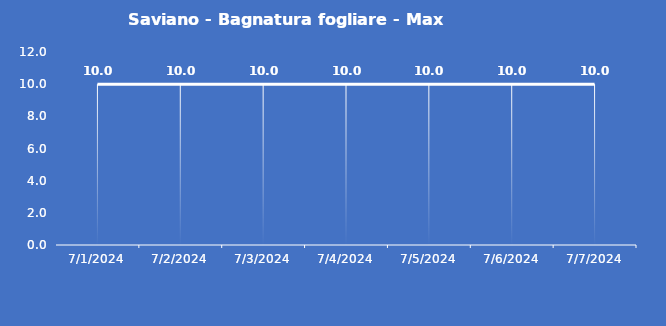
| Category | Saviano - Bagnatura fogliare - Max (min) |
|---|---|
| 7/1/24 | 10 |
| 7/2/24 | 10 |
| 7/3/24 | 10 |
| 7/4/24 | 10 |
| 7/5/24 | 10 |
| 7/6/24 | 10 |
| 7/7/24 | 10 |